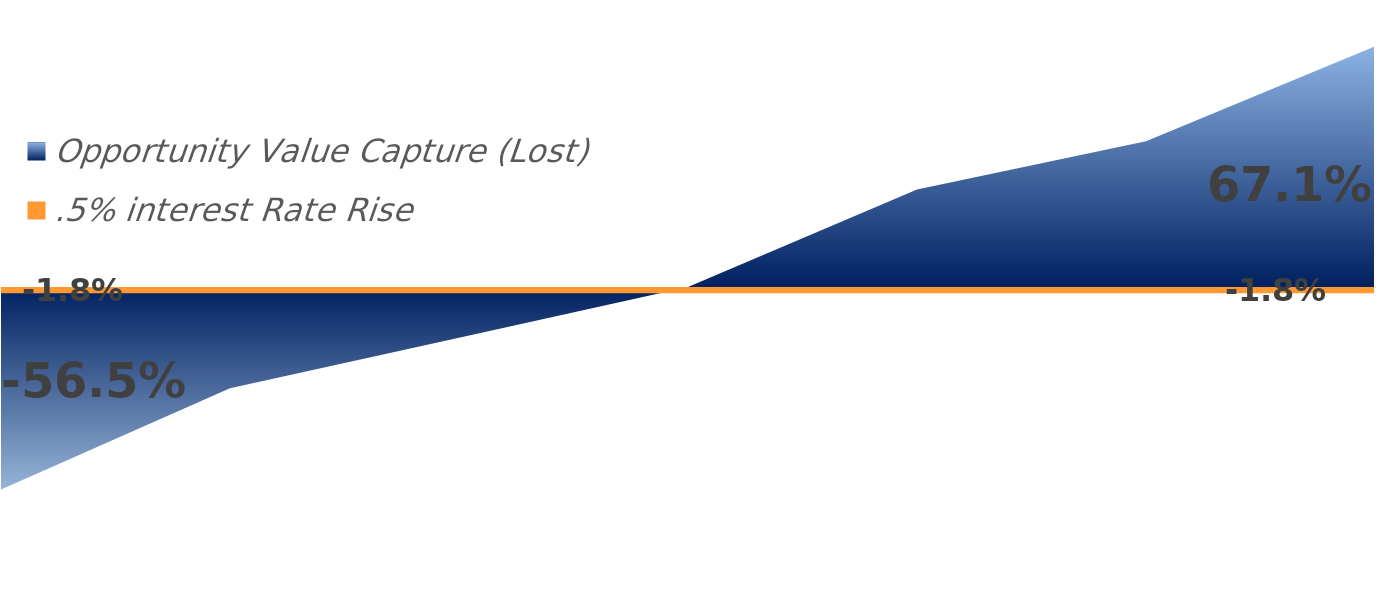
| Category | Series 1 | Opportunity Value Capture (Lost) | .5% interest Rate Rise |
|---|---|---|---|
| 0 | -0.565 | 0 | -0.018 |
| 1 | -0.282 | 0 | -0.018 |
| 2 | -0.141 | 0 | -0.018 |
| 3 | 0 | 0 | -0.018 |
| 4 | 0 | 0.272 | -0.018 |
| 5 | 0 | 0.407 | -0.018 |
| 6 | 0 | 0.671 | -0.018 |